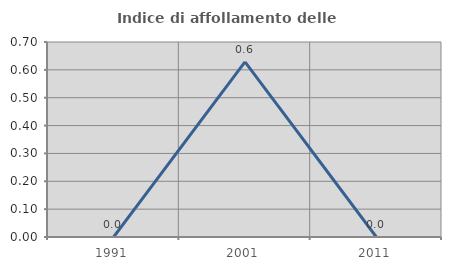
| Category | Indice di affollamento delle abitazioni  |
|---|---|
| 1991.0 | 0 |
| 2001.0 | 0.629 |
| 2011.0 | 0 |